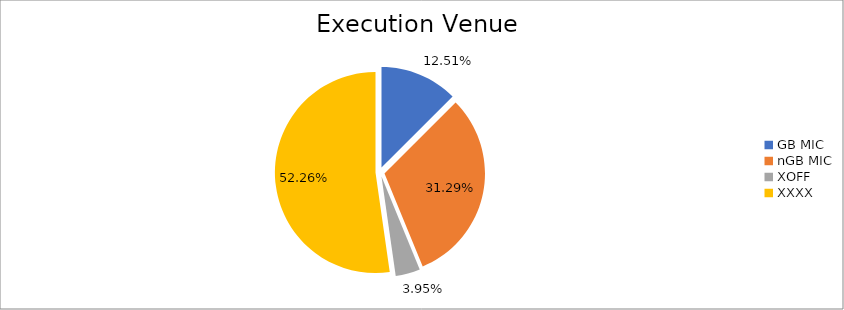
| Category | Series 0 |
|---|---|
| GB MIC | 1206795.647 |
| nGB MIC | 3019041.526 |
| XOFF | 380832.36 |
| XXXX | 5043333.197 |